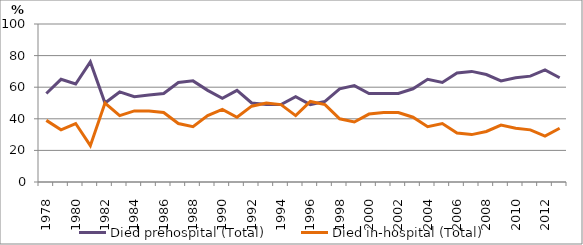
| Category | Died prehospital (Total) | Died in-hospital (Total) |
|---|---|---|
| 1978.0 | 56 | 39 |
| 1979.0 | 65 | 33 |
| 1980.0 | 62 | 37 |
| 1981.0 | 76 | 23 |
| 1982.0 | 50 | 50 |
| 1983.0 | 57 | 42 |
| 1984.0 | 54 | 45 |
| 1985.0 | 55 | 45 |
| 1986.0 | 56 | 44 |
| 1987.0 | 63 | 37 |
| 1988.0 | 64 | 35 |
| 1989.0 | 58 | 42 |
| 1990.0 | 53 | 46 |
| 1991.0 | 58 | 41 |
| 1992.0 | 50 | 48 |
| 1993.0 | 49 | 50 |
| 1994.0 | 49 | 49 |
| 1995.0 | 54 | 42 |
| 1996.0 | 49 | 51 |
| 1997.0 | 51 | 49 |
| 1998.0 | 59 | 40 |
| 1999.0 | 61 | 38 |
| 2000.0 | 56 | 43 |
| 2001.0 | 56 | 44 |
| 2002.0 | 56 | 44 |
| 2003.0 | 59 | 41 |
| 2004.0 | 65 | 35 |
| 2005.0 | 63 | 37 |
| 2006.0 | 69 | 31 |
| 2007.0 | 70 | 30 |
| 2008.0 | 68 | 32 |
| 2009.0 | 64 | 36 |
| 2010.0 | 66 | 34 |
| 2011.0 | 67 | 33 |
| 2012.0 | 71 | 29 |
| 2013.0 | 66 | 34 |